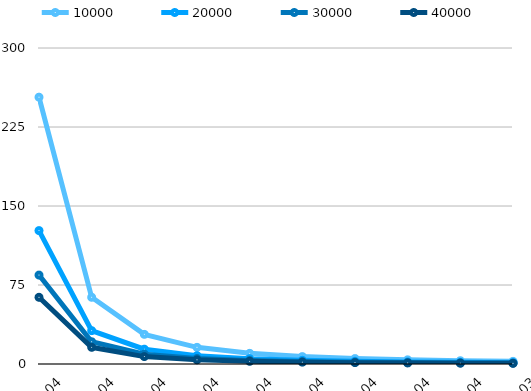
| Category | 10000 | 20000 | 30000 | 40000 |
|---|---|---|---|---|
| 1E-04 | 253.303 | 126.651 | 84.434 | 63.326 |
| 2E-04 | 63.326 | 31.663 | 21.109 | 15.831 |
| 3E-04 | 28.145 | 14.072 | 9.382 | 7.036 |
| 4E-04 | 15.831 | 7.916 | 5.277 | 3.958 |
| 5E-04 | 10.132 | 5.066 | 3.377 | 2.533 |
| 6E-04 | 7.036 | 3.518 | 2.345 | 1.759 |
| 7E-04 | 5.169 | 2.585 | 1.723 | 1.292 |
| 8E-04 | 3.958 | 1.979 | 1.319 | 0.989 |
| 9E-04 | 3.127 | 1.564 | 1.042 | 0.782 |
| 1E-03 | 2.533 | 1.267 | 0.844 | 0.633 |